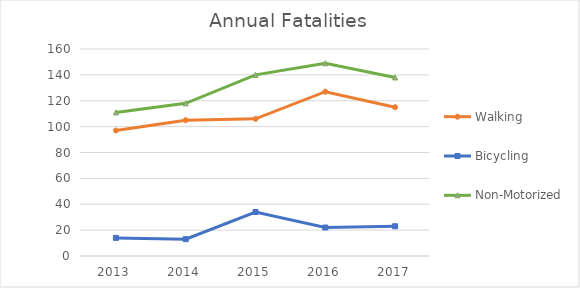
| Category | Walking | Bicycling | Non-Motorized |
|---|---|---|---|
| 2013 | 97 | 14 | 111 |
| 2014 | 105 | 13 | 118 |
| 2015 | 106 | 34 | 140 |
| 2016 | 127 | 22 | 149 |
| 2017 | 115 | 23 | 138 |